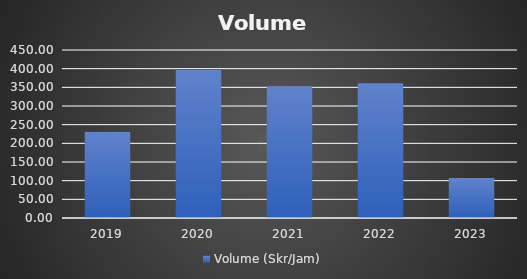
| Category | Volume (Skr/Jam) |
|---|---|
| 2019.0 | 231.217 |
| 2020.0 | 397.029 |
| 2021.0 | 352.983 |
| 2022.0 | 361.25 |
| 2023.0 | 107.279 |